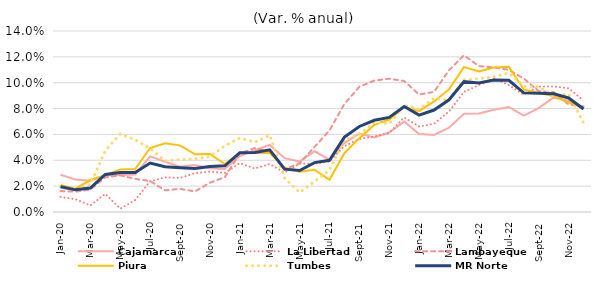
| Category | Cajamarca | La Libertad | Lambayeque | Piura | Tumbes | MR Norte |
|---|---|---|---|---|---|---|
| 2020-01-01 | 0.029 | 0.012 | 0.016 | 0.021 | 0.02 | 0.019 |
| 2020-02-01 | 0.025 | 0.01 | 0.016 | 0.018 | 0.017 | 0.017 |
| 2020-03-01 | 0.024 | 0.005 | 0.017 | 0.025 | 0.021 | 0.019 |
| 2020-04-01 | 0.028 | 0.014 | 0.027 | 0.029 | 0.047 | 0.029 |
| 2020-05-01 | 0.029 | 0.003 | 0.028 | 0.033 | 0.06 | 0.031 |
| 2020-06-01 | 0.029 | 0.009 | 0.026 | 0.033 | 0.056 | 0.031 |
| 2020-07-01 | 0.043 | 0.024 | 0.024 | 0.05 | 0.049 | 0.038 |
| 2020-08-01 | 0.039 | 0.027 | 0.017 | 0.053 | 0.039 | 0.035 |
| 2020-09-01 | 0.035 | 0.026 | 0.018 | 0.052 | 0.041 | 0.034 |
| 2020-10-01 | 0.036 | 0.03 | 0.016 | 0.045 | 0.041 | 0.034 |
| 2020-11-01 | 0.034 | 0.031 | 0.023 | 0.045 | 0.043 | 0.035 |
| 2020-12-01 | 0.033 | 0.03 | 0.027 | 0.037 | 0.051 | 0.036 |
| 2021-01-01 | 0.043 | 0.038 | 0.045 | 0.046 | 0.057 | 0.046 |
| 2021-02-01 | 0.048 | 0.034 | 0.049 | 0.046 | 0.054 | 0.046 |
| 2021-03-01 | 0.052 | 0.037 | 0.047 | 0.046 | 0.059 | 0.048 |
| 2021-04-01 | 0.042 | 0.031 | 0.033 | 0.034 | 0.026 | 0.033 |
| 2021-05-01 | 0.039 | 0.037 | 0.038 | 0.031 | 0.015 | 0.032 |
| 2021-06-01 | 0.047 | 0.037 | 0.05 | 0.033 | 0.024 | 0.038 |
| 2021-07-01 | 0.04 | 0.039 | 0.063 | 0.025 | 0.032 | 0.04 |
| 2021-08-01 | 0.054 | 0.051 | 0.084 | 0.046 | 0.056 | 0.058 |
| 2021-09-01 | 0.061 | 0.056 | 0.097 | 0.057 | 0.06 | 0.066 |
| 2021-10-01 | 0.058 | 0.058 | 0.102 | 0.067 | 0.069 | 0.071 |
| 2021-11-01 | 0.061 | 0.061 | 0.103 | 0.072 | 0.068 | 0.073 |
| 2021-12-01 | 0.07 | 0.073 | 0.101 | 0.081 | 0.083 | 0.082 |
| 2022-01-01 | 0.06 | 0.066 | 0.091 | 0.078 | 0.08 | 0.075 |
| 2022-02-01 | 0.06 | 0.068 | 0.093 | 0.086 | 0.088 | 0.079 |
| 2022-03-01 | 0.065 | 0.078 | 0.11 | 0.095 | 0.086 | 0.087 |
| 2022-04-01 | 0.076 | 0.093 | 0.121 | 0.112 | 0.102 | 0.101 |
| 2022-05-01 | 0.076 | 0.098 | 0.113 | 0.109 | 0.103 | 0.1 |
| 2022-06-01 | 0.079 | 0.103 | 0.112 | 0.112 | 0.104 | 0.102 |
| 2022-07-01 | 0.081 | 0.098 | 0.11 | 0.112 | 0.108 | 0.102 |
| 2022-08-01 | 0.074 | 0.091 | 0.103 | 0.095 | 0.097 | 0.092 |
| 2022-09-01 | 0.08 | 0.097 | 0.093 | 0.092 | 0.097 | 0.092 |
| 2022-10-01 | 0.089 | 0.097 | 0.093 | 0.09 | 0.089 | 0.092 |
| 2022-11-01 | 0.086 | 0.096 | 0.083 | 0.085 | 0.091 | 0.088 |
| 2022-12-01 | 0.081 | 0.086 | 0.082 | 0.08 | 0.069 | 0.08 |